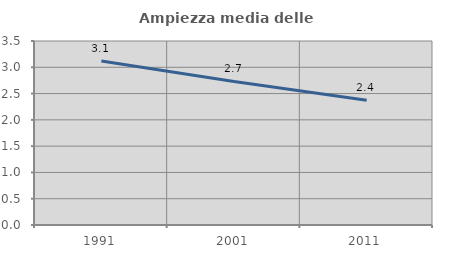
| Category | Ampiezza media delle famiglie |
|---|---|
| 1991.0 | 3.12 |
| 2001.0 | 2.731 |
| 2011.0 | 2.374 |